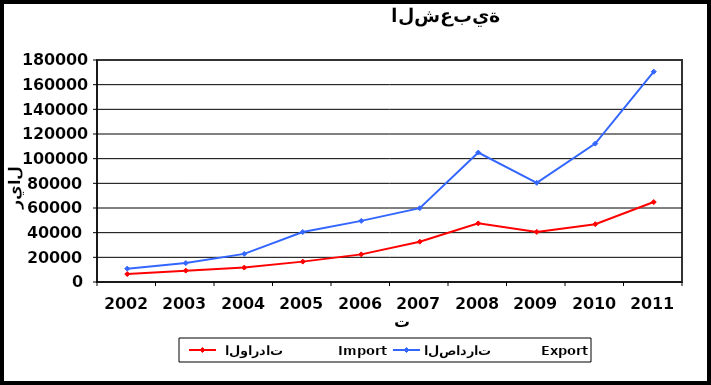
| Category |  الواردات           Import | الصادرات          Export |
|---|---|---|
| 2002.0 | 6441 | 10820 |
| 2003.0 | 9211 | 15367 |
| 2004.0 | 11681 | 22787 |
| 2005.0 | 16521 | 40519 |
| 2006.0 | 22391 | 49556 |
| 2007.0 | 32664 | 59840 |
| 2008.0 | 47541 | 104954 |
| 2009.0 | 40601 | 80417 |
| 2010.0 | 46851 | 112210 |
| 2011.0 | 64829 | 170500 |